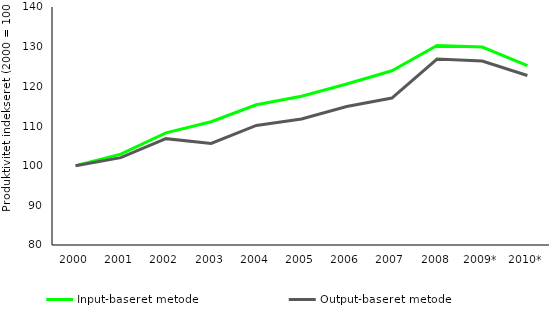
| Category | Input-baseret metode | Output-baseret metode |
|---|---|---|
| 2000 | 100 | 100 |
| 2001 | 102.907 | 102.024 |
| 2002 | 108.262 | 106.811 |
| 2003 | 111.085 | 105.594 |
| 2004 | 115.358 | 110.148 |
| 2005 | 117.489 | 111.753 |
| 2006 | 120.597 | 114.923 |
| 2007 | 123.92 | 117.055 |
| 2008 | 130.278 | 126.859 |
| 2009* | 129.89 | 126.36 |
| 2010* | 125.208 | 122.726 |